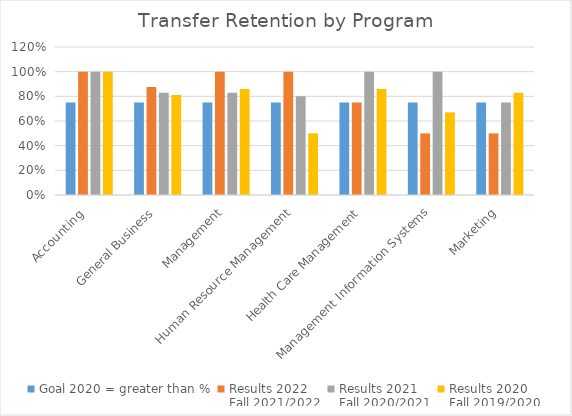
| Category | Goal 2020 = greater than % | Results 2022
Fall 2021/2022 | Results 2021
Fall 2020/2021 | Results 2020
Fall 2019/2020 |
|---|---|---|---|---|
| Accounting  | 0.75 | 1 | 1 | 1 |
| General Business | 0.75 | 0.875 | 0.83 | 0.81 |
| Management | 0.75 | 1 | 0.83 | 0.86 |
| Human Resource Management | 0.75 | 1 | 0.8 | 0.5 |
| Health Care Management | 0.75 | 0.75 | 1 | 0.86 |
| Management Information Systems | 0.75 | 0.5 | 1 | 0.67 |
| Marketing | 0.75 | 0.5 | 0.75 | 0.83 |